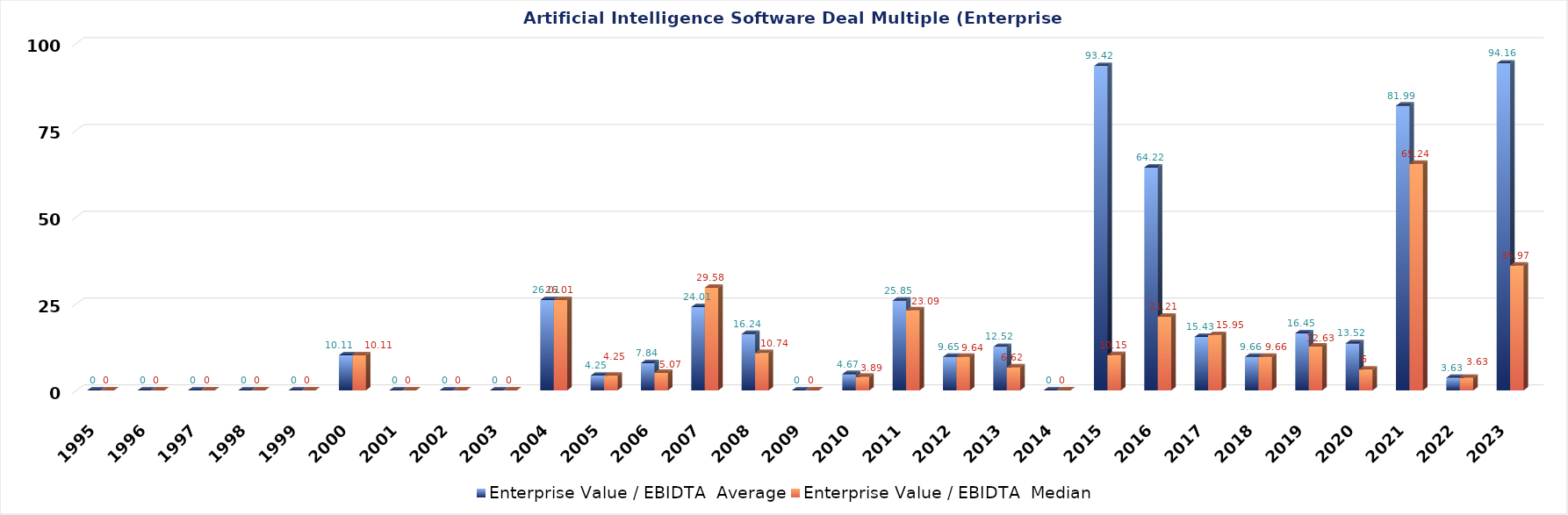
| Category | Enterprise Value / EBIDTA  |
|---|---|
| 1995 | 0 |
| 1996 | 0 |
| 1997 | 0 |
| 1998 | 0 |
| 1999 | 0 |
| 2000 | 10.11 |
| 2001 | 0 |
| 2002 | 0 |
| 2003 | 0 |
| 2004 | 26.01 |
| 2005 | 4.25 |
| 2006 | 5.07 |
| 2007 | 29.58 |
| 2008 | 10.74 |
| 2009 | 0 |
| 2010 | 3.89 |
| 2011 | 23.09 |
| 2012 | 9.64 |
| 2013 | 6.62 |
| 2014 | 0 |
| 2015 | 10.15 |
| 2016 | 21.21 |
| 2017 | 15.95 |
| 2018 | 9.66 |
| 2019 | 12.63 |
| 2020 | 6 |
| 2021 | 65.24 |
| 2022 | 3.63 |
| 2023 | 35.97 |